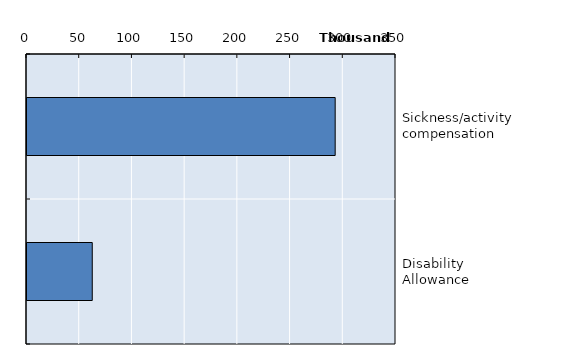
| Category | Series 0 |
|---|---|
| Sickness/activity compensation | 292318 |
| Disability Allowance | 61904 |